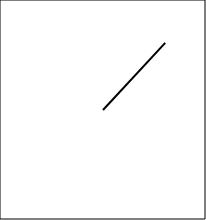
| Category | Series 0 |
|---|---|
| 0.0 | 0 |
| 7.071054825112364 | 7.071 |